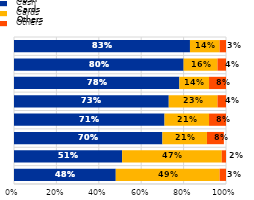
| Category | Cash | Cards | Others |
|---|---|---|---|
| Shop selling durable goods  | 0.48 | 0.49 | 0.03 |
| Petrol station | 0.51 | 0.47 | 0.02 |
| Other physical location | 0.7 | 0.21 | 0.08 |
| Venue for culture, sport or entertainment  | 0.71 | 0.21 | 0.08 |
| Local shop for day-to-day retail items and pharmacy | 0.73 | 0.23 | 0.04 |
| Charity and other P2P payments  | 0.78 | 0.14 | 0.08 |
| Vending or ticketing machine  | 0.8 | 0.16 | 0.04 |
| Restaurant, bar or café and hotel or accommodation | 0.83 | 0.14 | 0.03 |